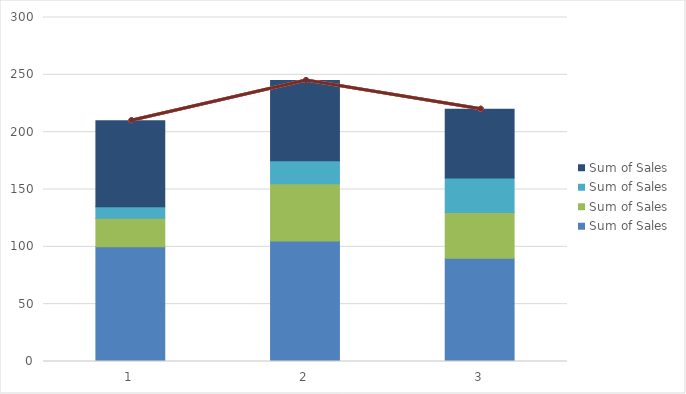
| Category | a - Sum of Sales | b - Sum of Sales | c - Sum of Sales | d - Sum of Sales |
|---|---|---|---|---|
| 1 | 100 | 25 | 10 | 75 |
| 2 | 105 | 50 | 20 | 70 |
| 3 | 90 | 40 | 30 | 60 |